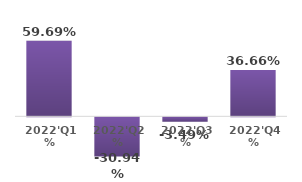
| Category | Series 0 |
|---|---|
| 2022'Q1 % | 0.597 |
| 2022'Q2 % | -0.309 |
| 2022'Q3 % | -0.035 |
| 2022'Q4 % | 0.367 |